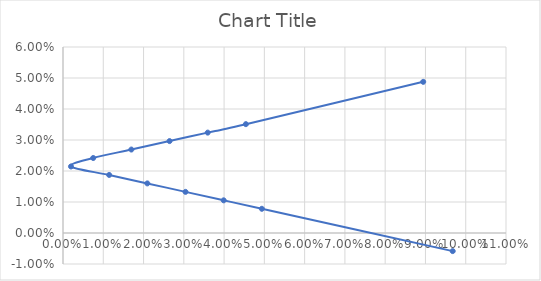
| Category | Series 0 |
|---|---|
| 0.08944157822338965 | 0.049 |
| 0.04540988034094193 | 0.035 |
| 0.0359314371923351 | 0.032 |
| 0.026452994043728282 | 0.03 |
| 0.016974550895121458 | 0.027 |
| 0.007496107746514619 | 0.024 |
| 0.001982335402092203 | 0.021 |
| 0.011460778550699015 | 0.019 |
| 0.020939221699305836 | 0.016 |
| 0.03041766484791266 | 0.013 |
| 0.03989610799651949 | 0.011 |
| 0.04937455114512633 | 0.008 |
| 0.09676676688816045 | -0.006 |